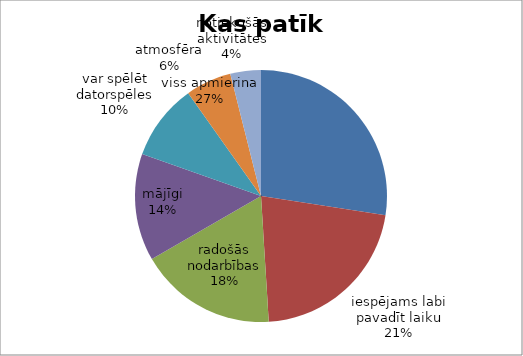
| Category | Kas patīk BJC? |
|---|---|
| viss apmierina | 14 |
| iespējams labi pavadīt laiku | 11 |
| radošās nodarbības | 9 |
| mājīgi | 7 |
| var spēlēt datorspēles | 5 |
| atmosfēra | 3 |
| notiekošās aktivitātes | 2 |